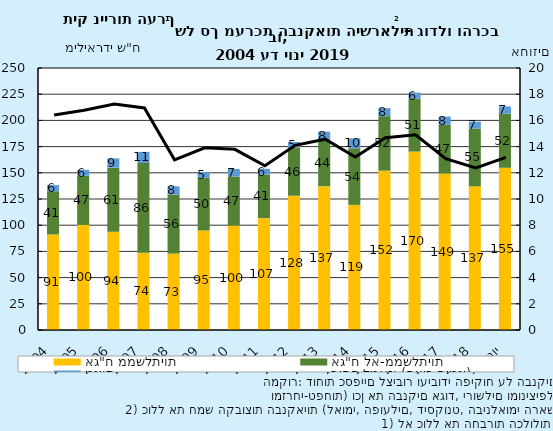
| Category | אג"ח ממשלתיות | אג"ח לא-ממשלתיות | מניות |
|---|---|---|---|
| 2004 | 91.126 | 41.25 | 5.897 |
| 2005 | 100.249 | 46.883 | 5.719 |
| 2006 | 93.639 | 61.287 | 8.852 |
| 2007 | 73.7 | 85.624 | 10.6 |
| 2008 | 72.856 | 56.44 | 7.853 |
| 2009 | 94.968 | 50.358 | 5.266 |
| 2010 | 99.652 | 46.739 | 7.299 |
| 2011 | 106.734 | 41.489 | 5.601 |
| 2012 | 128.124 | 45.796 | 5.459 |
| 2013 | 137.215 | 44.436 | 7.607 |
| 2014 | 119.373 | 54.039 | 9.544 |
| 2015 | 152.016 | 52.04 | 7.672 |
| 2016 | 170.263 | 50.627 | 5.635 |
| 2017 | 149.289 | 46.563 | 7.827 |
| 2018 | 137.084 | 55.056 | 6.661 |
| יוני-19 | 154.809 | 51.579 | 7.013 |